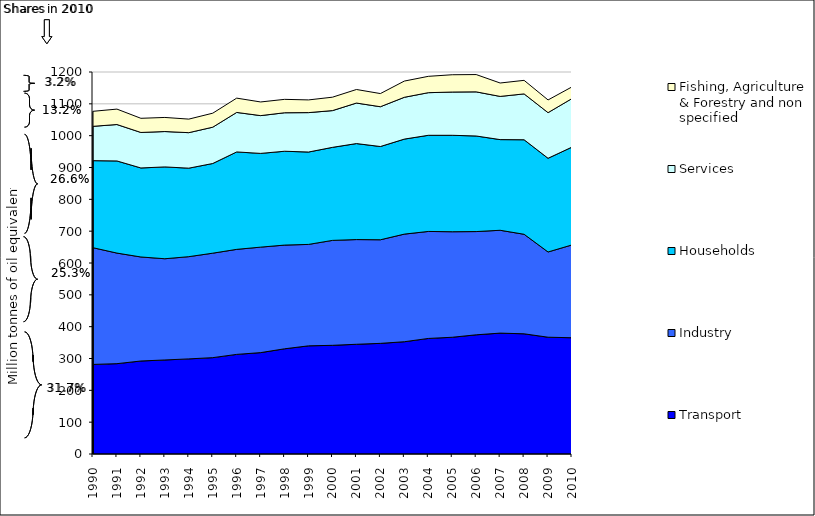
| Category | Transport | Industry | Households | Services | Fishing, Agriculture & Forestry and non specified |
|---|---|---|---|---|---|
| 1990.0 | 281.41 | 366.629 | 273.5 | 107.757 | 47.233 |
| 1991.0 | 283.759 | 347.39 | 289.461 | 114.416 | 48.413 |
| 1992.0 | 292.148 | 326.792 | 279.622 | 111.49 | 44.47 |
| 1993.0 | 295.435 | 317.945 | 288.454 | 111.112 | 44.285 |
| 1994.0 | 298.822 | 321.093 | 277.983 | 111.53 | 42.583 |
| 1995.0 | 302.674 | 328.185 | 281.746 | 114.049 | 43.998 |
| 1996.0 | 312.926 | 329.894 | 306.091 | 124.091 | 44.908 |
| 1997.0 | 318.485 | 331.338 | 294.47 | 118.69 | 42.884 |
| 1998.0 | 330.526 | 325.736 | 294.815 | 120.873 | 42.106 |
| 1999.0 | 339.806 | 318.569 | 290.238 | 123.818 | 39.882 |
| 2000.0 | 341.381 | 329.673 | 292.245 | 115.46 | 42.144 |
| 2001.0 | 344.7 | 328.922 | 301.57 | 127.266 | 42.571 |
| 2002.0 | 347.552 | 325.422 | 292.935 | 125.019 | 41.311 |
| 2003.0 | 352.707 | 338.032 | 298.491 | 131.337 | 50.916 |
| 2004.0 | 363.005 | 336.135 | 302.012 | 133.889 | 51.354 |
| 2005.0 | 366.715 | 331.471 | 302.977 | 135.874 | 54.366 |
| 2006.0 | 374.414 | 324.301 | 300.249 | 138.615 | 54.391 |
| 2007.0 | 379.758 | 323.067 | 284.822 | 135.665 | 42.124 |
| 2008.0 | 377.575 | 312.671 | 296.884 | 144.074 | 42.542 |
| 2009.0 | 366.895 | 267.757 | 294.341 | 143.295 | 39.923 |
| 2010.0 | 365.218 | 291.604 | 307.325 | 152.42 | 36.745 |